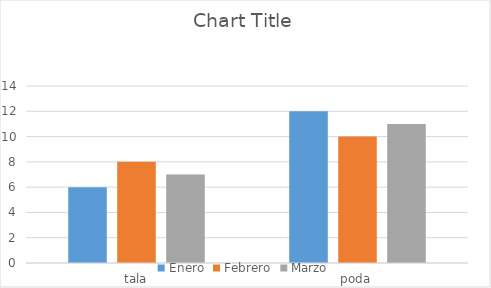
| Category | Enero | Febrero | Marzo |
|---|---|---|---|
| tala | 6 | 8 | 7 |
| poda | 12 | 10 | 11 |